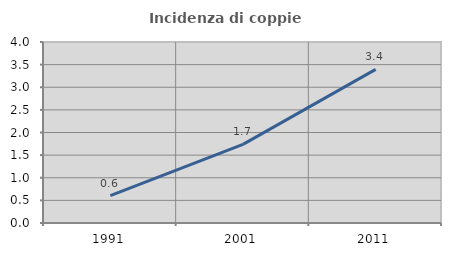
| Category | Incidenza di coppie miste |
|---|---|
| 1991.0 | 0.604 |
| 2001.0 | 1.737 |
| 2011.0 | 3.396 |